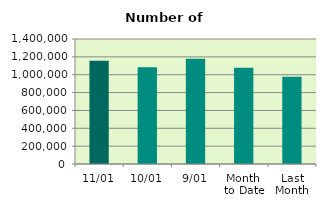
| Category | Series 0 |
|---|---|
| 11/01 | 1155182 |
| 10/01 | 1083842 |
| 9/01 | 1179574 |
| Month 
to Date | 1077664.25 |
| Last
Month | 976608.095 |